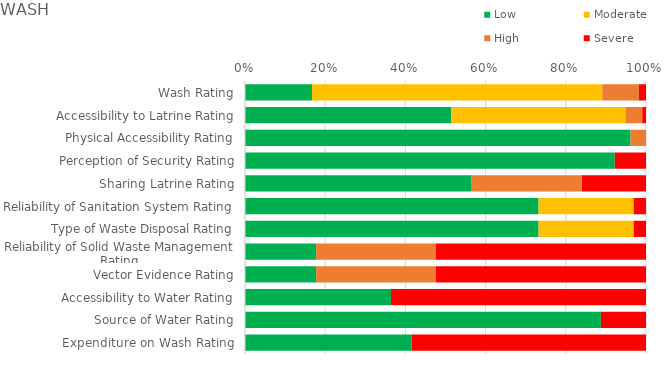
| Category | Low | Moderate | High | Severe |
|---|---|---|---|---|
| Wash Rating | 0.167 | 0.724 | 0.091 | 0.018 |
| Accessibility to Latrine Rating | 0.515 | 0.434 | 0.042 | 0.009 |
| Physical Accessibility Rating | 0.962 | 0 | 0.038 | 0 |
| Perception of Security Rating | 0.922 | 0 | 0 | 0.078 |
| Sharing Latrine Rating | 0.564 | 0 | 0.276 | 0.16 |
| Reliability of Sanitation System Rating | 0.732 | 0.237 | 0 | 0.031 |
| Type of Waste Disposal Rating | 0.732 | 0.237 | 0 | 0.031 |
| Reliability of Solid Waste Management Rating | 0.177 | 0 | 0.298 | 0.524 |
| Vector Evidence Rating | 0.177 | 0 | 0.298 | 0.524 |
| Accessibility to Water Rating | 0.364 | 0 | 0 | 0.636 |
| Source of Water Rating | 0.888 | 0 | 0 | 0.112 |
| Expenditure on Wash Rating | 0.415 | 0 | 0 | 0.585 |